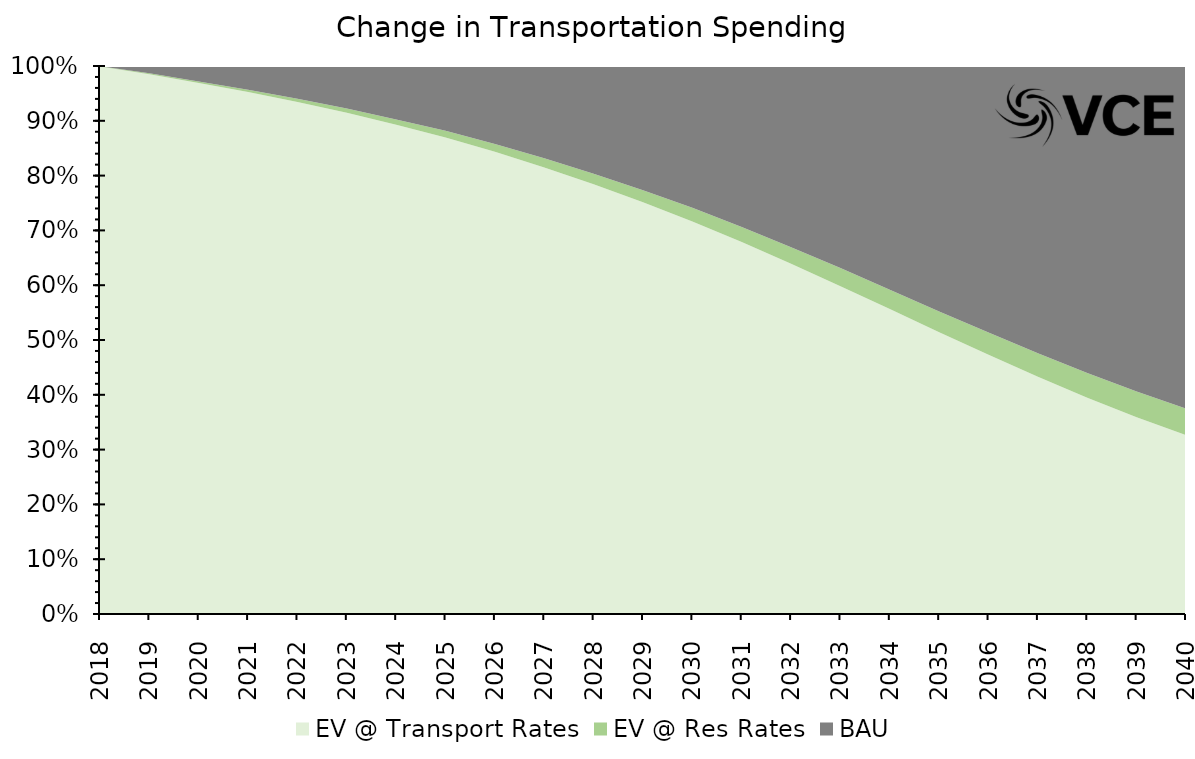
| Category | EV @ Transport Rates | EV @ Res Rates | BAU |
|---|---|---|---|
| 2018.0 | 0.999 | 0.001 | 0 |
| 2019.0 | 0.985 | 0.002 | 0.013 |
| 2020.0 | 0.969 | 0.003 | 0.028 |
| 2021.0 | 0.952 | 0.004 | 0.043 |
| 2022.0 | 0.934 | 0.006 | 0.06 |
| 2023.0 | 0.915 | 0.008 | 0.078 |
| 2024.0 | 0.893 | 0.01 | 0.097 |
| 2025.0 | 0.87 | 0.012 | 0.118 |
| 2026.0 | 0.843 | 0.014 | 0.142 |
| 2027.0 | 0.815 | 0.017 | 0.168 |
| 2028.0 | 0.784 | 0.019 | 0.197 |
| 2029.0 | 0.751 | 0.022 | 0.227 |
| 2030.0 | 0.716 | 0.025 | 0.259 |
| 2031.0 | 0.679 | 0.028 | 0.294 |
| 2032.0 | 0.639 | 0.03 | 0.331 |
| 2033.0 | 0.598 | 0.033 | 0.369 |
| 2034.0 | 0.556 | 0.036 | 0.408 |
| 2035.0 | 0.514 | 0.038 | 0.448 |
| 2036.0 | 0.473 | 0.041 | 0.486 |
| 2037.0 | 0.433 | 0.043 | 0.524 |
| 2038.0 | 0.395 | 0.045 | 0.56 |
| 2039.0 | 0.359 | 0.047 | 0.594 |
| 2040.0 | 0.327 | 0.048 | 0.625 |